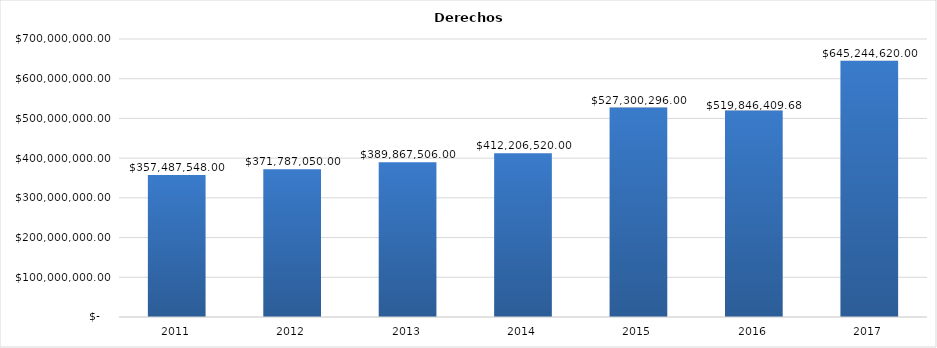
| Category | Derechos (total) |
|---|---|
| 2011.0 | 357487548 |
| 2012.0 | 371787050 |
| 2013.0 | 389867506 |
| 2014.0 | 412206520 |
| 2015.0 | 527300296 |
| 2016.0 | 519846409.68 |
| 2017.0 | 645244620 |